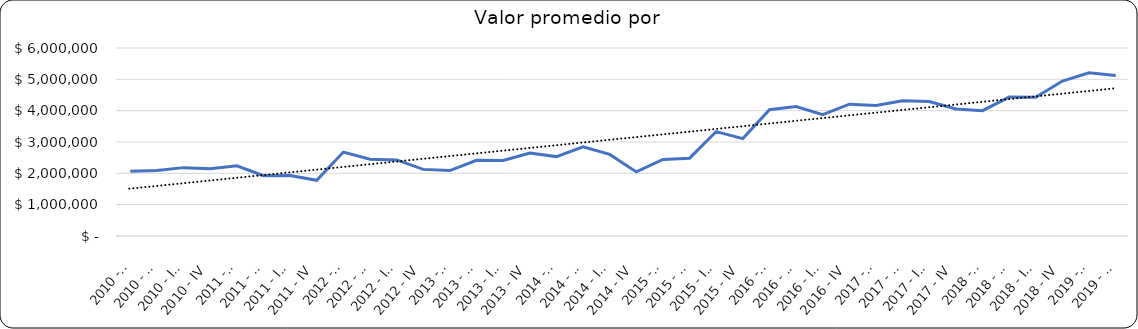
| Category | Valor m2 en Bogotá por sectores |
|---|---|
| 2010 - I | 2066193.853 |
| 2010 - II | 2091100.965 |
| 2010 - III | 2182033.097 |
| 2010 - IV | 2146572.104 |
| 2011 - I | 2240196.078 |
| 2011 - II | 1926470.588 |
| 2011 - III | 1928921.569 |
| 2011 - IV | 1776960.784 |
| 2012 - I | 2678571.429 |
| 2012 - II | 2452380.952 |
| 2012 - III | 2428571.429 |
| 2012 - IV | 2126190.476 |
| 2013 - I | 2088888.889 |
| 2013 - II | 2416666.667 |
| 2013 - III | 2409259.259 |
| 2013 - IV | 2650000 |
| 2014 - I | 2534259.259 |
| 2014 - II | 2847222.222 |
| 2014 - III | 2604166.667 |
| 2014 - IV | 2046296.296 |
| 2015 - I | 2443693.694 |
| 2015 - II | 2484234.234 |
| 2015 - III | 3333333.333 |
| 2015 - IV | 3108108.108 |
| 2016 - I | 4027777.778 |
| 2016 - II | 4130773.81 |
| 2016 - III | 3875000 |
| 2016 - IV | 4205882.353 |
| 2017 - I | 4166666.667 |
| 2017 - II | 4318264.081 |
| 2017 - III | 4291987.179 |
| 2017 - IV | 4053452.116 |
| 2018 - I | 4000000 |
| 2018 - II | 4433077.579 |
| 2018 - III | 4428571 |
| 2018 - IV | 4944324 |
| 2019 - I | 5206349 |
| 2019 - II | 5119048 |